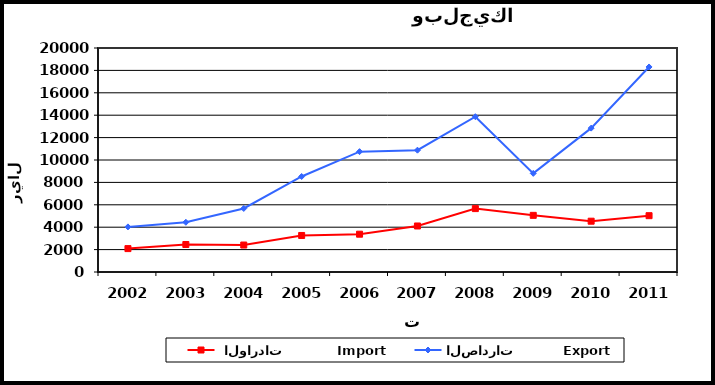
| Category |  الواردات           Import | الصادرات          Export |
|---|---|---|
| 2002.0 | 2089 | 4027 |
| 2003.0 | 2454 | 4440 |
| 2004.0 | 2407 | 5673 |
| 2005.0 | 3261 | 8528 |
| 2006.0 | 3376 | 10746 |
| 2007.0 | 4109 | 10877 |
| 2008.0 | 5660 | 13867 |
| 2009.0 | 5058 | 8807 |
| 2010.0 | 4536 | 12845 |
| 2011.0 | 5028 | 18305 |